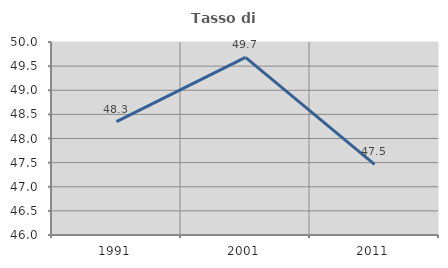
| Category | Tasso di occupazione   |
|---|---|
| 1991.0 | 48.35 |
| 2001.0 | 49.682 |
| 2011.0 | 47.462 |